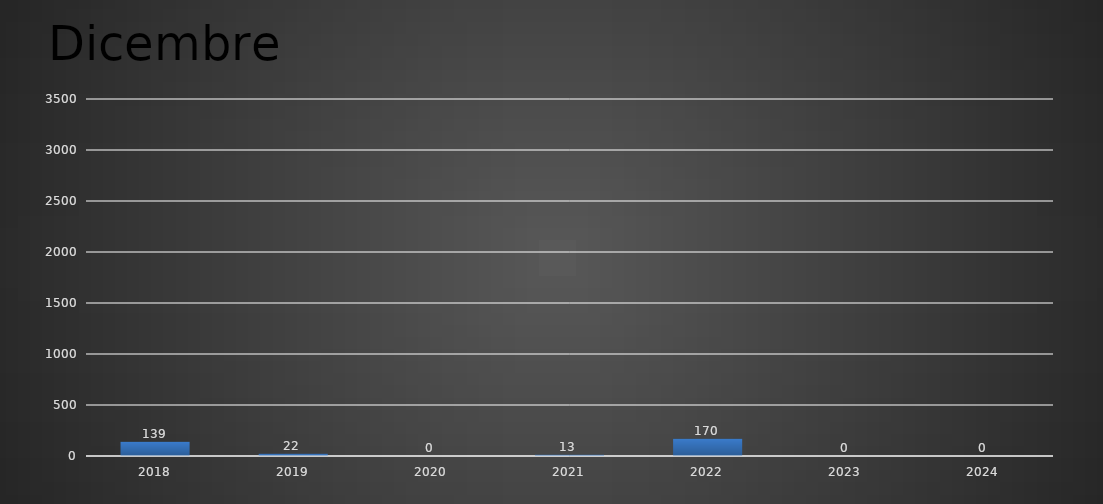
| Category | Dicembre |
|---|---|
| 2018.0 | 139 |
| 2019.0 | 22 |
| 2020.0 | 0 |
| 2021.0 | 13 |
| 2022.0 | 170 |
| 2023.0 | 0 |
| 2024.0 | 0 |